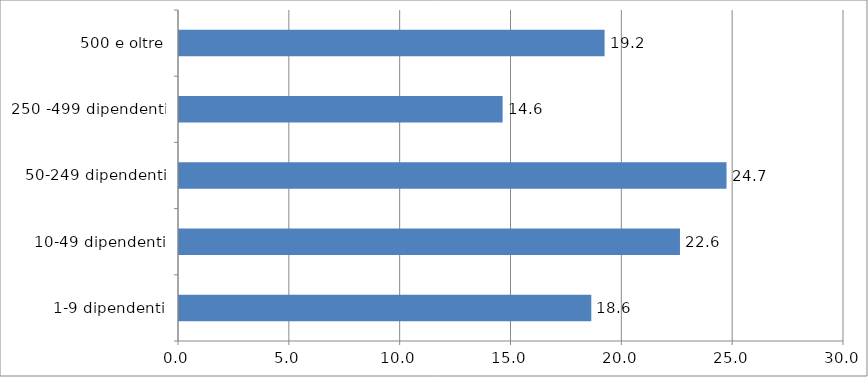
| Category | Series 0 |
|---|---|
| 1-9 dipendenti | 18.6 |
| 10-49 dipendenti | 22.6 |
| 50-249 dipendenti | 24.7 |
| 250 -499 dipendenti | 14.6 |
| 500 e oltre | 19.2 |